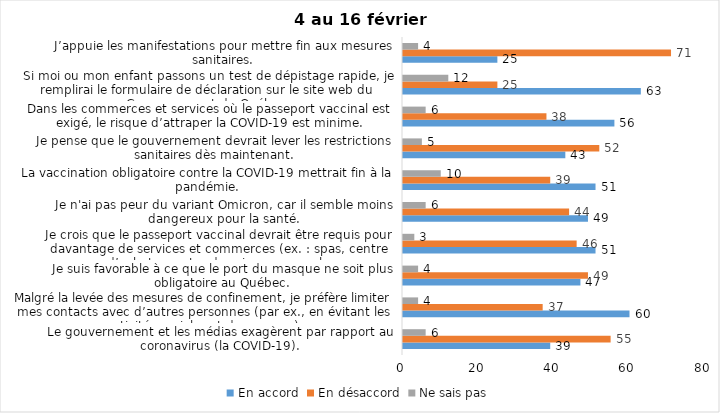
| Category | En accord | En désaccord | Ne sais pas |
|---|---|---|---|
| Le gouvernement et les médias exagèrent par rapport au coronavirus (la COVID-19). | 39 | 55 | 6 |
| Malgré la levée des mesures de confinement, je préfère limiter mes contacts avec d’autres personnes (par ex., en évitant les activités sociales et de groupes) | 60 | 37 | 4 |
| Je suis favorable à ce que le port du masque ne soit plus obligatoire au Québec. | 47 | 49 | 4 |
| Je crois que le passeport vaccinal devrait être requis pour davantage de services et commerces (ex. : spas, centre d’achats, centre de soins personnels. | 51 | 46 | 3 |
| Je n'ai pas peur du variant Omicron, car il semble moins dangereux pour la santé. | 49 | 44 | 6 |
| La vaccination obligatoire contre la COVID-19 mettrait fin à la pandémie. | 51 | 39 | 10 |
| Je pense que le gouvernement devrait lever les restrictions sanitaires dès maintenant. | 43 | 52 | 5 |
| Dans les commerces et services où le passeport vaccinal est exigé, le risque d’attraper la COVID-19 est minime. | 56 | 38 | 6 |
| Si moi ou mon enfant passons un test de dépistage rapide, je remplirai le formulaire de déclaration sur le site web du Gouvernement du Québec. | 63 | 25 | 12 |
| J’appuie les manifestations pour mettre fin aux mesures sanitaires. | 25 | 71 | 4 |